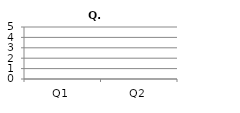
| Category | Series 6 |
|---|---|
| Q1 | 0 |
| Q2 | 0 |